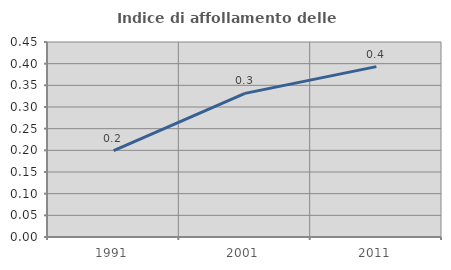
| Category | Indice di affollamento delle abitazioni  |
|---|---|
| 1991.0 | 0.2 |
| 2001.0 | 0.331 |
| 2011.0 | 0.393 |